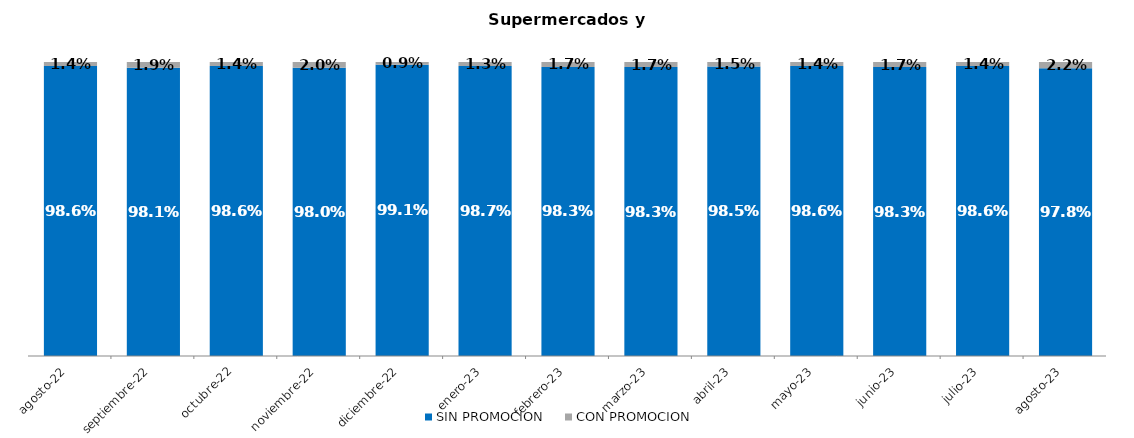
| Category | SIN PROMOCION   | CON PROMOCION   |
|---|---|---|
| 2022-08-01 | 0.986 | 0.014 |
| 2022-09-01 | 0.981 | 0.019 |
| 2022-10-01 | 0.986 | 0.014 |
| 2022-11-01 | 0.98 | 0.02 |
| 2022-12-01 | 0.991 | 0.009 |
| 2023-01-01 | 0.987 | 0.013 |
| 2023-02-01 | 0.983 | 0.017 |
| 2023-03-01 | 0.983 | 0.017 |
| 2023-04-01 | 0.985 | 0.015 |
| 2023-05-01 | 0.986 | 0.014 |
| 2023-06-01 | 0.983 | 0.017 |
| 2023-07-01 | 0.986 | 0.014 |
| 2023-08-01 | 0.978 | 0.022 |